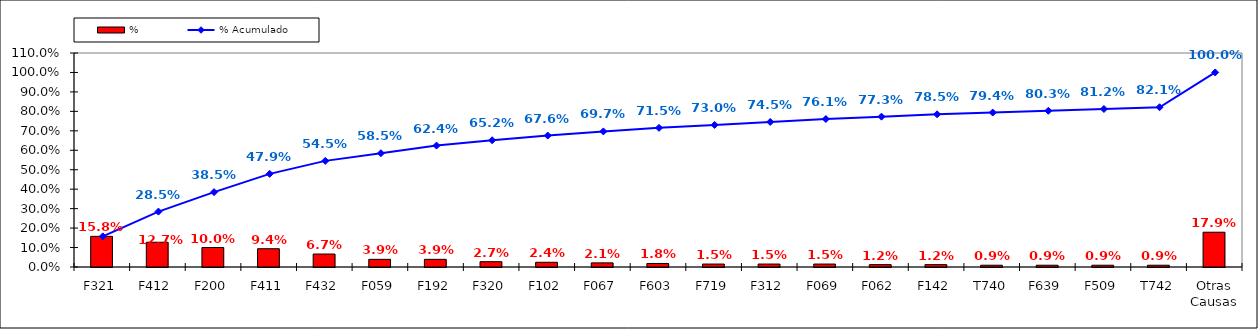
| Category | % |
|---|---|
| F321 | 0.158 |
| F412 | 0.127 |
| F200 | 0.1 |
| F411 | 0.094 |
| F432 | 0.067 |
| F059 | 0.039 |
| F192 | 0.039 |
| F320 | 0.027 |
| F102 | 0.024 |
| F067 | 0.021 |
| F603 | 0.018 |
| F719 | 0.015 |
| F312 | 0.015 |
| F069 | 0.015 |
| F062 | 0.012 |
| F142 | 0.012 |
| T740 | 0.009 |
| F639 | 0.009 |
| F509 | 0.009 |
| T742 | 0.009 |
| Otras Causas | 0.179 |